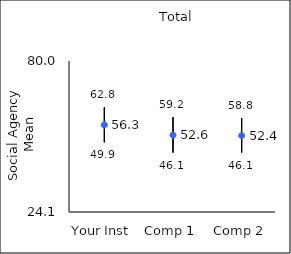
| Category | 25th percentile | 75th percentile | Mean |
|---|---|---|---|
| Your Inst | 49.9 | 62.8 | 56.34 |
| Comp 1 | 46.1 | 59.2 | 52.59 |
| Comp 2 | 46.1 | 58.8 | 52.39 |